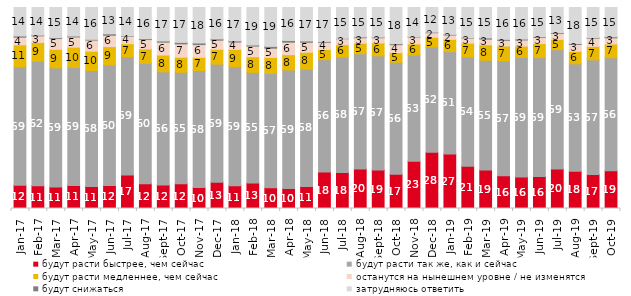
| Category | будут расти быстрее, чем сейчас | будут расти так же, как и сейчас | будут расти медленнее, чем сейчас | останутся на нынешнем уровне / не изменятся | будут снижаться | затрудняюсь ответить |
|---|---|---|---|---|---|---|
| 2017-01-01 | 11.6 | 58.85 | 10.95 | 3.85 | 0.6 | 14.15 |
| 2017-02-01 | 11.35 | 61.95 | 9.3 | 3.3 | 0.35 | 13.75 |
| 2017-03-01 | 10.7 | 59.25 | 9.25 | 5.35 | 0.45 | 15 |
| 2017-04-01 | 11.45 | 58.75 | 10.05 | 5.1 | 0.45 | 14.2 |
| 2017-05-01 | 11 | 57.65 | 9.6 | 5.55 | 0.35 | 15.85 |
| 2017-06-01 | 11.5 | 59.85 | 9.2 | 5.65 | 0.7 | 13.1 |
| 2017-07-01 | 16.7 | 58.8 | 6.5 | 3.75 | 0.25 | 14 |
| 2017-08-01 | 12.35 | 59.85 | 7.2 | 4.65 | 0.45 | 15.5 |
| 2017-09-01 | 11.75 | 56.25 | 8.35 | 6.4 | 0.6 | 16.65 |
| 2017-10-01 | 12.3 | 55.45 | 7.5 | 6.65 | 0.75 | 17.35 |
| 2017-11-01 | 10.4 | 58.25 | 6.55 | 6.35 | 0.8 | 17.65 |
| 2017-12-01 | 13.1 | 58.7 | 7.4 | 4.55 | 0.65 | 15.6 |
| 2018-01-01 | 11.35 | 59.2 | 8.6 | 3.65 | 0.6 | 16.6 |
| 2018-02-01 | 12.7 | 55.05 | 7.75 | 5.3 | 0.55 | 18.65 |
| 2018-03-01 | 10.3 | 56.85 | 8 | 4.6 | 0.9 | 19.35 |
| 2018-04-01 | 9.9 | 59 | 7.65 | 6.2 | 0.85 | 16.4 |
| 2018-05-01 | 10.95 | 58.4 | 8.4 | 4.95 | 0.65 | 16.65 |
| 2018-06-01 | 18.15 | 55.9 | 5.05 | 3.6 | 0.4 | 16.9 |
| 2018-07-01 | 17.85 | 57.5 | 6.15 | 2.95 | 0.2 | 15.35 |
| 2018-08-01 | 19.65 | 57.35 | 5.25 | 2.7 | 0.4 | 14.65 |
| 2018-09-01 | 19.1 | 56.85 | 6.4 | 2.6 | 0.3 | 14.75 |
| 2018-10-01 | 17.1 | 55.65 | 4.8 | 3.95 | 0.5 | 18 |
| 2018-11-01 | 23.453 | 52.894 | 5.539 | 3.443 | 0.2 | 14.471 |
| 2018-12-01 | 27.95 | 52.45 | 4.8 | 2.25 | 0.3 | 12.25 |
| 2019-01-01 | 27.15 | 50.9 | 6.1 | 2.15 | 0.3 | 13.4 |
| 2019-02-01 | 21.05 | 54.35 | 6.85 | 2.55 | 0.2 | 15 |
| 2019-03-01 | 19.095 | 54.649 | 7.708 | 2.834 | 0.597 | 15.117 |
| 2019-04-01 | 16.287 | 57.178 | 7.376 | 2.822 | 0.495 | 15.842 |
| 2019-05-01 | 15.701 | 59.435 | 5.646 | 3.071 | 0.446 | 15.701 |
| 2019-06-01 | 15.86 | 59.202 | 6.983 | 3.092 | 0.349 | 14.514 |
| 2019-07-01 | 19.604 | 59.406 | 5.099 | 2.921 | 0.396 | 12.574 |
| 2019-08-01 | 18.482 | 53.497 | 6.194 | 3.447 | 0.45 | 17.932 |
| 2019-09-01 | 16.881 | 57.079 | 6.683 | 4.01 | 0.297 | 15.05 |
| 2019-10-01 | 18.762 | 56.238 | 6.832 | 3.069 | 0.545 | 14.554 |